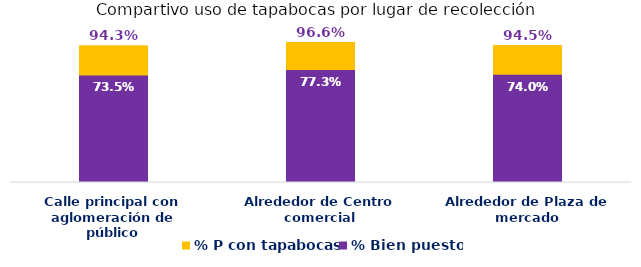
| Category | % P con tapabocas | % Bien puesto |
|---|---|---|
| Calle principal con aglomeración de público | 0.943 | 0.735 |
| Alrededor de Centro comercial | 0.966 | 0.773 |
| Alrededor de Plaza de mercado | 0.945 | 0.74 |